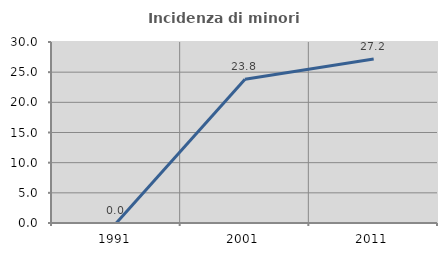
| Category | Incidenza di minori stranieri |
|---|---|
| 1991.0 | 0 |
| 2001.0 | 23.841 |
| 2011.0 | 27.168 |